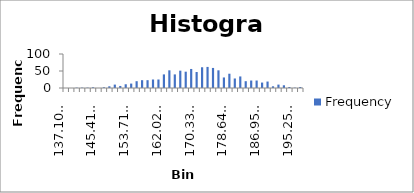
| Category | Frequency |
|---|---|
| 137.1020449 | 0 |
| 138.4867405 | 0 |
| 139.8714361 | 1 |
| 141.2561317 | 1 |
| 142.6408273 | 1 |
| 144.0255229 | 2 |
| 145.4102185 | 0 |
| 146.7949141 | 2 |
| 148.1796097 | 5 |
| 149.5643053 | 10 |
| 150.9490009 | 6 |
| 152.3336965 | 11 |
| 153.7183922 | 13 |
| 155.1030878 | 20 |
| 156.4877834 | 23 |
| 157.872479 | 23 |
| 159.2571746 | 25 |
| 160.6418702 | 25 |
| 162.0265658 | 40 |
| 163.4112614 | 52 |
| 164.795957 | 40 |
| 166.1806526 | 51 |
| 167.5653482 | 48 |
| 168.9500438 | 56 |
| 170.3347395 | 47 |
| 171.7194351 | 61 |
| 173.1041307 | 62 |
| 174.4888263 | 59 |
| 175.8735219 | 52 |
| 177.2582175 | 31 |
| 178.6429131 | 42 |
| 180.0276087 | 28 |
| 181.4123043 | 34 |
| 182.7969999 | 20 |
| 184.1816955 | 22 |
| 185.5663911 | 22 |
| 186.9510868 | 16 |
| 188.3357824 | 19 |
| 189.720478 | 5 |
| 191.1051736 | 10 |
| 192.4898692 | 8 |
| 193.8745648 | 3 |
| 195.2592604 | 1 |
| More | 3 |